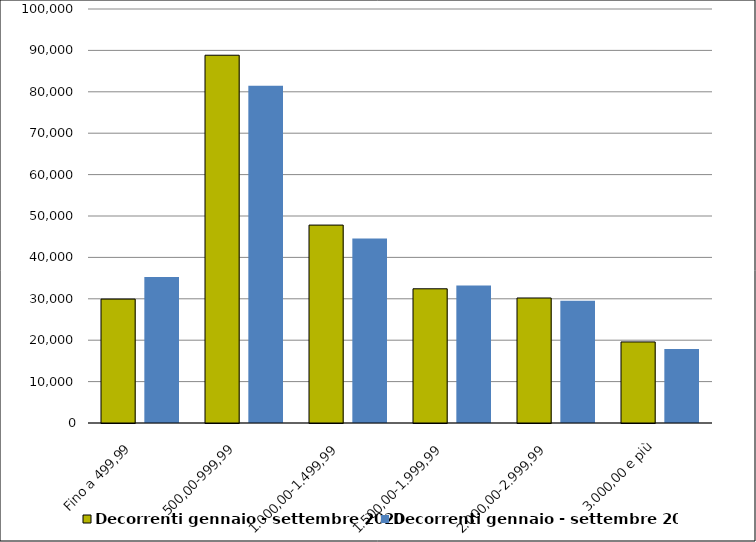
| Category | Decorrenti gennaio - settembre 2020 | Decorrenti gennaio - settembre 2019 |
|---|---|---|
| Fino a 499,99 | 29931 | 35239 |
| 500,00-999,99 | 88833 | 81449 |
| 1.000,00-1.499,99 | 47804 | 44538 |
| 1.500,00-1.999,99 | 32419 | 33242 |
| 2.000,00-2.999,99 | 30197 | 29554 |
| 3.000,00 e più | 19579 | 17892 |